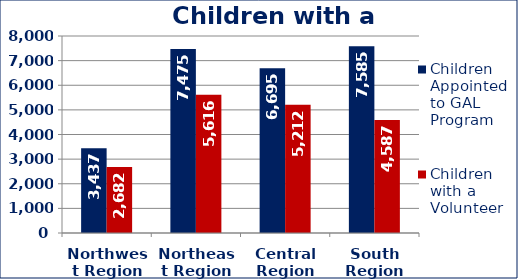
| Category | Children Appointed to GAL Program  | Children with a Volunteer  |
|---|---|---|
| Northwest Region | 3437 | 2682 |
| Northeast Region | 7475 | 5616 |
| Central Region | 6695 | 5212 |
| South Region | 7585 | 4587 |